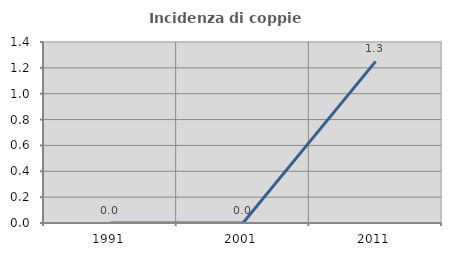
| Category | Incidenza di coppie miste |
|---|---|
| 1991.0 | 0 |
| 2001.0 | 0 |
| 2011.0 | 1.25 |